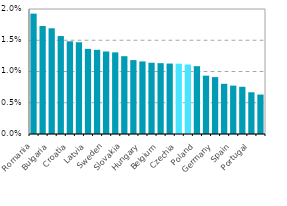
| Category | Series 0 |
|---|---|
| Romania | 0.019 |
| Estonia | 0.017 |
| Bulgaria | 0.017 |
| United Kingdom | 0.016 |
| Croatia | 0.015 |
| France | 0.015 |
| Latvia | 0.014 |
| Slovenia | 0.013 |
| Sweden | 0.013 |
| Finland | 0.013 |
| Slovakia | 0.012 |
| Ireland | 0.012 |
| Hungary | 0.012 |
| Greece | 0.011 |
| Belgium | 0.011 |
| Denmark | 0.011 |
| Czechia | 0.011 |
| EU28 | 0.011 |
| Poland | 0.011 |
| Italy | 0.009 |
| Germany | 0.009 |
| Lithuania | 0.008 |
| Spain | 0.008 |
| Austria | 0.008 |
| Portugal | 0.007 |
| Netherlands | 0.006 |